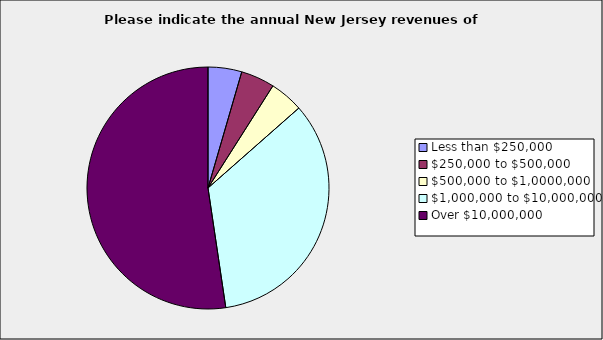
| Category | Series 0 |
|---|---|
| Less than $250,000 | 0.045 |
| $250,000 to $500,000 | 0.045 |
| $500,000 to $1,0000,000 | 0.045 |
| $1,000,000 to $10,000,000 | 0.341 |
| Over $10,000,000 | 0.523 |